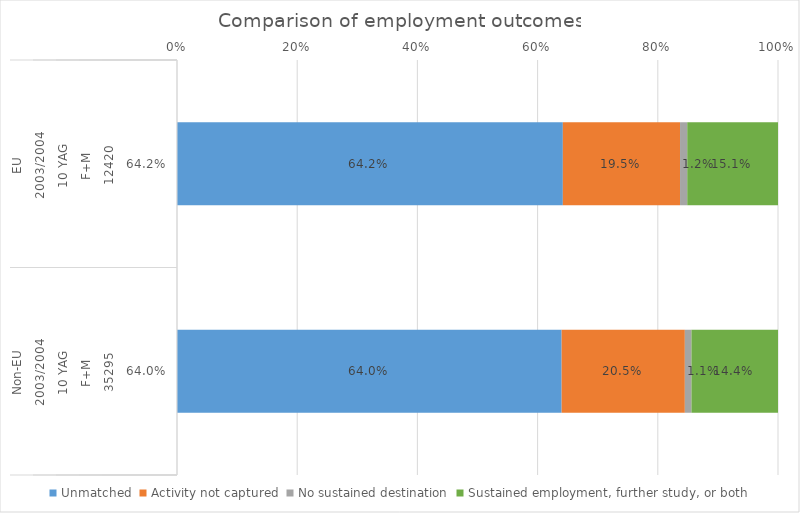
| Category | Unmatched | Activity not captured | No sustained destination | Sustained employment, further study, or both |
|---|---|---|---|---|
| 0 | 0.642 | 0.195 | 0.012 | 0.151 |
| 1 | 0.64 | 0.205 | 0.011 | 0.144 |